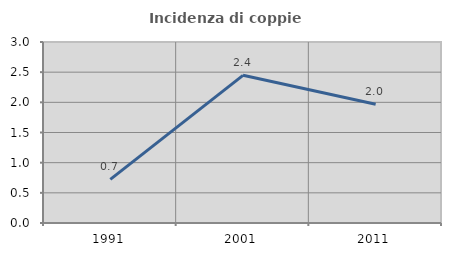
| Category | Incidenza di coppie miste |
|---|---|
| 1991.0 | 0.722 |
| 2001.0 | 2.448 |
| 2011.0 | 1.968 |